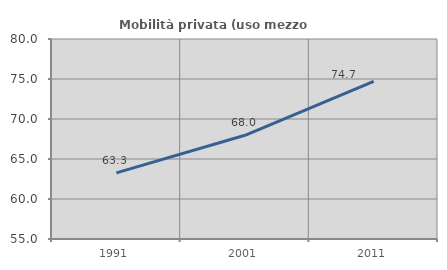
| Category | Mobilità privata (uso mezzo privato) |
|---|---|
| 1991.0 | 63.273 |
| 2001.0 | 67.965 |
| 2011.0 | 74.704 |